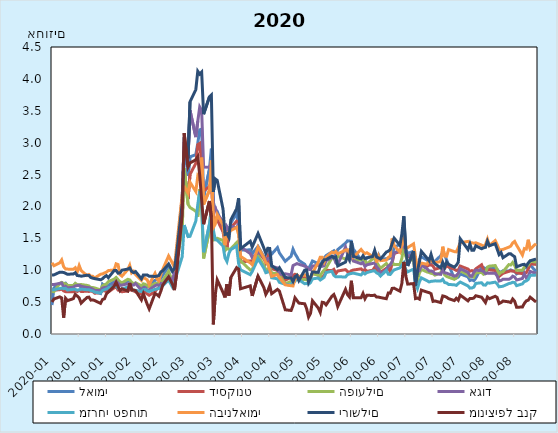
| Category | לאומי | דיסקונט | הפועלים | אגוד | מזרחי טפחות | הבינלאומי | ירושלים | מוניציפל בנק |
|---|---|---|---|---|---|---|---|---|
| 2020-01-01 02:00:00 | 0.454 | 0.688 | 0.67 | 0.778 | 0.696 | 1.116 | 0.926 | 0.502 |
| 2020-01-02 02:00:00 | 0.723 | 0.689 | 0.664 | 0.775 | 0.695 | 1.071 | 0.927 | 0.549 |
| 2020-01-05 02:00:00 | 0.786 | 0.694 | 0.792 | 0.794 | 0.712 | 1.116 | 0.969 | 0.582 |
| 2020-01-06 02:00:00 | 0.804 | 0.708 | 0.808 | 0.801 | 0.72 | 1.161 | 0.968 | 0.565 |
| 2020-01-07 02:00:00 | 0.787 | 0.676 | 0.791 | 0.736 | 0.711 | 1.055 | 0.965 | 0.256 |
| 2020-01-08 02:00:00 | 0.798 | 0.664 | 0.789 | 0.749 | 0.716 | 1.02 | 0.951 | 0.56 |
| 2020-01-09 02:00:00 | 0.761 | 0.664 | 0.76 | 0.724 | 0.69 | 1.017 | 0.936 | 0.523 |
| 2020-01-12 02:00:00 | 0.759 | 0.661 | 0.76 | 0.733 | 0.701 | 1.014 | 0.941 | 0.555 |
| 2020-01-13 02:00:00 | 0.786 | 0.683 | 0.794 | 0.754 | 0.699 | 1.039 | 0.96 | 0.623 |
| 2020-01-14 02:00:00 | 0.766 | 0.666 | 0.771 | 0.76 | 0.687 | 0.973 | 0.916 | 0.594 |
| 2020-01-15 02:00:00 | 0.759 | 0.686 | 0.773 | 0.766 | 0.693 | 1.073 | 0.914 | 0.564 |
| 2020-01-16 02:00:00 | 0.729 | 0.666 | 0.776 | 0.749 | 0.703 | 0.995 | 0.906 | 0.484 |
| 2020-01-19 02:00:00 | 0.705 | 0.671 | 0.762 | 0.729 | 0.694 | 0.916 | 0.921 | 0.573 |
| 2020-01-20 02:00:00 | 0.715 | 0.667 | 0.754 | 0.727 | 0.695 | 0.933 | 0.917 | 0.578 |
| 2020-01-21 02:00:00 | 0.72 | 0.674 | 0.728 | 0.718 | 0.682 | 0.904 | 0.886 | 0.531 |
| 2020-01-22 02:00:00 | 0.7 | 0.667 | 0.729 | 0.702 | 0.674 | 0.904 | 0.875 | 0.535 |
| 2020-01-23 02:00:00 | 0.663 | 0.639 | 0.722 | 0.683 | 0.656 | 0.879 | 0.868 | 0.524 |
| 2020-01-26 02:00:00 | 0.635 | 0.649 | 0.691 | 0.681 | 0.643 | 0.937 | 0.85 | 0.48 |
| 2020-01-27 02:00:00 | 0.782 | 0.683 | 0.756 | 0.72 | 0.682 | 0.942 | 0.867 | 0.541 |
| 2020-01-28 02:00:00 | 0.756 | 0.677 | 0.774 | 0.728 | 0.694 | 0.957 | 0.895 | 0.551 |
| 2020-01-29 02:00:00 | 0.751 | 0.666 | 0.784 | 0.73 | 0.707 | 0.97 | 0.916 | 0.627 |
| 2020-01-30 02:00:00 | 0.764 | 0.659 | 0.822 | 0.698 | 0.722 | 0.995 | 0.882 | 0.66 |
| 2020-02-02 02:00:00 | 0.821 | 0.723 | 0.86 | 0.782 | 0.749 | 1.005 | 0.996 | 0.75 |
| 2020-02-03 02:00:00 | 0.823 | 0.74 | 0.887 | 0.826 | 0.755 | 1.1 | 0.996 | 0.811 |
| 2020-02-04 02:00:00 | 0.808 | 0.689 | 0.851 | 0.798 | 0.716 | 1.088 | 0.953 | 0.742 |
| 2020-02-05 02:00:00 | 0.769 | 0.686 | 0.821 | 0.763 | 0.697 | 0.929 | 0.958 | 0.676 |
| 2020-02-06 02:00:00 | 0.772 | 0.663 | 0.802 | 0.767 | 0.705 | 0.907 | 1 | 0.709 |
| 2020-02-09 02:00:00 | 0.835 | 0.675 | 0.858 | 0.788 | 0.737 | 1.01 | 1.018 | 0.672 |
| 2020-02-10 02:00:00 | 0.832 | 0.698 | 0.849 | 0.789 | 0.735 | 1.078 | 1.035 | 0.798 |
| 2020-02-11 02:00:00 | 0.771 | 0.685 | 0.811 | 0.767 | 0.706 | 0.958 | 0.982 | 0.692 |
| 2020-02-12 02:00:00 | 0.78 | 0.675 | 0.788 | 0.767 | 0.685 | 0.984 | 0.962 | 0.69 |
| 2020-02-13 02:00:00 | 0.797 | 0.661 | 0.801 | 0.792 | 0.685 | 0.933 | 0.978 | 0.679 |
| 2020-02-16 02:00:00 | 0.725 | 0.625 | 0.756 | 0.686 | 0.665 | 0.841 | 0.866 | 0.535 |
| 2020-02-17 02:00:00 | 0.763 | 0.646 | 0.788 | 0.726 | 0.696 | 0.894 | 0.926 | 0.631 |
| 2020-02-18 02:00:00 | 0.741 | 0.652 | 0.779 | 0.726 | 0.7 | 0.869 | 0.924 | 0.549 |
| 2020-02-19 02:00:00 | 0.745 | 0.629 | 0.75 | 0.69 | 0.675 | 0.848 | 0.926 | 0.466 |
| 2020-02-20 02:00:00 | 0.779 | 0.607 | 0.74 | 0.694 | 0.667 | 0.774 | 0.906 | 0.394 |
| 2020-02-23 02:00:00 | 0.841 | 0.664 | 0.794 | 0.757 | 0.7 | 0.95 | 0.902 | 0.636 |
| 2020-02-24 02:00:00 | 0.851 | 0.706 | 0.79 | 0.771 | 0.707 | 0.864 | 0.907 | 0.618 |
| 2020-02-25 02:00:00 | 0.845 | 0.719 | 0.807 | 0.758 | 0.715 | 0.834 | 0.918 | 0.592 |
| 2020-02-26 02:00:00 | 0.871 | 0.741 | 0.813 | 0.792 | 0.736 | 0.936 | 0.973 | 0.672 |
| 2020-02-27 02:00:00 | 0.922 | 0.763 | 0.837 | 0.781 | 0.757 | 1.013 | 0.992 | 0.767 |
| 2020-03-01 02:00:00 | 1.062 | 0.87 | 0.983 | 0.895 | 0.846 | 1.224 | 1.098 | 0.896 |
| 2020-03-03 02:00:00 | 0.975 | 0.809 | 0.821 | 0.84 | 0.733 | 1.109 | 0.985 | 0.777 |
| 2020-03-04 02:00:00 | 1.003 | 0.834 | 0.874 | 0.975 | 0.776 | 1.041 | 1.024 | 0.688 |
| 2020-03-05 02:00:00 | 1.266 | 1.057 | 1.116 | 1.182 | 0.916 | 1.335 | 1.224 | 0.928 |
| 2020-03-08 02:00:00 | 2.106 | 1.816 | 1.621 | 2.161 | 1.213 | 2.184 | 2.049 | 1.867 |
| 2020-03-09 02:00:00 | 3.086 | 2.565 | 2.599 | 3.014 | 1.707 | 2.314 | 2.876 | 3.15 |
| 2020-03-11 02:00:00 | 2.483 | 2.116 | 2.034 | 2.767 | 1.527 | 2.209 | 2.752 | 2.619 |
| 2020-03-12 02:00:00 | 2.779 | 2.501 | 1.984 | 3.506 | 1.532 | 2.38 | 3.638 | 2.684 |
| 2020-03-15 02:00:00 | 2.813 | 2.676 | 1.925 | 3.088 | 1.771 | 2.234 | 3.833 | 2.73 |
| 2020-03-16 02:00:00 | 2.991 | 2.97 | 1.84 | 3.337 | 2.029 | 2.475 | 4.12 | 2.78 |
| 2020-03-17 02:00:00 | 3.201 | 2.989 | 2.27 | 3.559 | 2.242 | 2.424 | 4.074 | 2.492 |
| 2020-03-18 02:00:00 | 3.212 | 2.666 | 1.982 | 3.504 | 2.027 | 2.765 | 4.107 | 2.103 |
| 2020-03-19 02:00:00 | 2.149 | 2.245 | 1.183 | 2.619 | 1.282 | 2.031 | 3.447 | 1.721 |
| 2020-03-22 02:00:00 | 2.581 | 2.312 | 1.628 | 2.614 | 1.72 | 2.254 | 3.719 | 2.085 |
| 2020-03-23 02:00:00 | 2.905 | 2.41 | 2.053 | 2.687 | 1.972 | 2.721 | 3.749 | 1.831 |
| 2020-03-24 02:00:00 | 2.072 | 1.848 | 1.473 | 1.984 | 1.63 | 1.668 | 2.227 | 0.151 |
| 2020-03-25 02:00:00 | 1.951 | 1.809 | 1.479 | 1.986 | 1.479 | 1.721 | 2.432 | 0.612 |
| 2020-03-26 02:00:00 | 1.923 | 1.791 | 1.5 | 1.884 | 1.471 | 1.872 | 2.409 | 0.849 |
| 2020-03-29 03:00:00 | 1.683 | 1.601 | 1.467 | 1.763 | 1.381 | 1.712 | 1.957 | 0.651 |
| 2020-03-30 03:00:00 | 1.497 | 1.409 | 1.306 | 1.464 | 1.195 | 1.393 | 1.561 | 0.573 |
| 2020-03-31 03:00:00 | 1.463 | 1.336 | 1.342 | 1.684 | 1.137 | 1.573 | 1.573 | 0.782 |
| 2020-04-01 03:00:00 | 1.482 | 1.598 | 1.328 | 1.635 | 1.263 | 1.602 | 1.516 | 0.601 |
| 2020-04-02 03:00:00 | 1.738 | 1.663 | 1.335 | 1.693 | 1.323 | 1.623 | 1.789 | 0.886 |
| 2020-04-05 03:00:00 | 1.9 | 1.77 | 1.433 | 1.664 | 1.379 | 1.673 | 1.964 | 1.04 |
| 2020-04-06 03:00:00 | 1.653 | 1.755 | 1.194 | 1.723 | 1.107 | 1.556 | 2.129 | 1.017 |
| 2020-04-07 03:00:00 | 1.318 | 1.129 | 1.149 | 1.365 | 1.006 | 1.217 | 1.336 | 0.709 |
| 2020-04-12 03:00:00 | 1.319 | 1.147 | 1.003 | 1.262 | 0.93 | 1.115 | 1.454 | 0.755 |
| 2020-04-13 03:00:00 | 1.26 | 1.135 | 1.009 | 1.197 | 0.98 | 1.086 | 1.364 | 0.598 |
| 2020-04-16 03:00:00 | 1.373 | 1.293 | 1.227 | 1.281 | 1.18 | 1.362 | 1.575 | 0.907 |
| 2020-04-19 03:00:00 | 1.21 | 1.178 | 1.073 | 1.212 | 1.032 | 1.199 | 1.348 | 0.729 |
| 2020-04-20 03:00:00 | 1.114 | 1.123 | 1.013 | 1.141 | 0.961 | 1.119 | 1.265 | 0.621 |
| 2020-04-21 03:00:00 | 1.172 | 1.208 | 1.011 | 1.183 | 0.97 | 1.099 | 1.344 | 0.675 |
| 2020-04-22 03:00:00 | 1.299 | 1.103 | 1.055 | 1.191 | 1.023 | 1.004 | 1.342 | 0.756 |
| 2020-04-23 03:00:00 | 1.252 | 1.025 | 0.952 | 1.062 | 0.882 | 0.904 | 1.072 | 0.632 |
| 2020-04-26 03:00:00 | 1.355 | 0.995 | 0.949 | 1.036 | 0.865 | 0.932 | 1.008 | 0.7 |
| 2020-04-27 03:00:00 | 1.271 | 0.945 | 0.915 | 0.934 | 0.81 | 0.881 | 1.039 | 0.672 |
| 2020-04-30 03:00:00 | 1.14 | 0.843 | 0.787 | 0.944 | 0.78 | 0.771 | 0.886 | 0.38 |
| 2020-05-03 03:00:00 | 1.22 | 0.888 | 0.825 | 0.927 | 0.769 | 0.757 | 0.878 | 0.369 |
| 2020-05-04 03:00:00 | 1.33 | 0.919 | 0.85 | 1.073 | 0.821 | 0.754 | 0.824 | 0.446 |
| 2020-05-05 03:00:00 | 1.259 | 0.937 | 0.859 | 1.087 | 0.825 | 0.856 | 0.899 | 0.568 |
| 2020-05-06 03:00:00 | 1.21 | 0.928 | 0.912 | 1.104 | 0.873 | 0.885 | 0.919 | 0.527 |
| 2020-05-07 03:00:00 | 1.154 | 0.902 | 0.839 | 1.094 | 0.851 | 0.894 | 0.837 | 0.484 |
| 2020-05-10 03:00:00 | 1.094 | 0.883 | 0.857 | 1.065 | 0.788 | 0.928 | 1.001 | 0.474 |
| 2020-05-11 03:00:00 | 1.035 | 0.864 | 0.847 | 1.05 | 0.793 | 0.911 | 1.003 | 0.396 |
| 2020-05-12 03:00:00 | 1.025 | 0.839 | 0.851 | 1.017 | 0.78 | 0.873 | 0.814 | 0.265 |
| 2020-05-13 03:00:00 | 1.08 | 0.864 | 0.896 | 1.008 | 0.805 | 0.891 | 0.886 | 0.324 |
| 2020-05-14 03:00:00 | 1.145 | 0.958 | 0.944 | 1.064 | 0.864 | 0.954 | 0.973 | 0.521 |
| 2020-05-17 03:00:00 | 1.103 | 0.921 | 0.924 | 1.081 | 0.878 | 1.128 | 0.967 | 0.406 |
| 2020-05-18 03:00:00 | 1.063 | 0.889 | 0.908 | 1.065 | 0.846 | 1.204 | 1.065 | 0.339 |
| 2020-05-19 03:00:00 | 1.141 | 0.893 | 0.966 | 1.061 | 0.867 | 1.203 | 1.116 | 0.497 |
| 2020-05-20 03:00:00 | 1.19 | 0.912 | 1.003 | 1.07 | 0.889 | 1.128 | 1.164 | 0.491 |
| 2020-05-21 03:00:00 | 1.23 | 0.999 | 1.035 | 1.149 | 0.964 | 1.203 | 1.165 | 0.457 |
| 2020-05-24 03:00:00 | 1.285 | 0.995 | 1.192 | 1.199 | 0.984 | 1.284 | 1.221 | 0.593 |
| 2020-05-25 03:00:00 | 1.304 | 1.014 | 1.187 | 1.216 | 0.92 | 1.27 | 1.195 | 0.619 |
| 2020-05-26 03:00:00 | 1.244 | 0.946 | 1.143 | 1.116 | 0.896 | 1.294 | 1.207 | 0.545 |
| 2020-05-27 03:00:00 | 1.324 | 0.988 | 1.22 | 1.091 | 0.898 | 1.255 | 1.067 | 0.43 |
| 2020-05-31 03:00:00 | 1.425 | 1.009 | 1.176 | 1.362 | 0.894 | 1.317 | 1.127 | 0.7 |
| 2020-06-01 03:00:00 | 1.46 | 0.98 | 1.181 | 1.258 | 0.931 | 1.321 | 1.227 | 0.618 |
| 2020-06-02 03:00:00 | 1.457 | 0.961 | 1.178 | 1.165 | 0.942 | 1.22 | 1.167 | 0.581 |
| 2020-06-03 03:00:00 | 1.455 | 0.992 | 1.201 | 1.234 | 0.949 | 1.291 | 1.455 | 0.835 |
| 2020-06-04 03:00:00 | 1.333 | 1.003 | 1.148 | 1.145 | 0.955 | 1.203 | 1.215 | 0.567 |
| 2020-06-08 03:00:00 | 1.159 | 1.022 | 1.162 | 1.101 | 0.926 | 1.326 | 1.179 | 0.568 |
| 2020-06-09 03:00:00 | 1.152 | 0.99 | 1.188 | 1.116 | 0.961 | 1.287 | 1.227 | 0.636 |
| 2020-06-10 03:00:00 | 1.148 | 1.012 | 1.154 | 1.058 | 0.941 | 1.261 | 1.182 | 0.553 |
| 2020-06-11 03:00:00 | 1.197 | 0.984 | 1.097 | 1.085 | 0.963 | 1.275 | 1.192 | 0.609 |
| 2020-06-14 03:00:00 | 1.224 | 1 | 1.179 | 1.107 | 0.988 | 1.214 | 1.216 | 0.603 |
| 2020-06-15 03:00:00 | 1.245 | 1.045 | 1.18 | 1.113 | 0.991 | 1.283 | 1.312 | 0.61 |
| 2020-06-16 03:00:00 | 1.174 | 1.013 | 1.122 | 1.053 | 0.958 | 1.122 | 1.207 | 0.579 |
| 2020-06-17 03:00:00 | 1.24 | 0.985 | 1.077 | 1.019 | 0.944 | 1.224 | 1.192 | 0.578 |
| 2020-06-18 03:00:00 | 1.17 | 0.966 | 1.03 | 0.946 | 0.909 | 1.15 | 1.176 | 0.572 |
| 2020-06-21 03:00:00 | 1.182 | 1.029 | 1.106 | 1.006 | 0.996 | 1.159 | 1.285 | 0.553 |
| 2020-06-22 03:00:00 | 1.18 | 1.041 | 1.059 | 1.066 | 0.937 | 1.2 | 1.299 | 0.643 |
| 2020-06-23 03:00:00 | 1.191 | 0.977 | 1.092 | 1.081 | 0.933 | 1.221 | 1.324 | 0.64 |
| 2020-06-24 03:00:00 | 1.236 | 1.116 | 1.125 | 1.141 | 0.973 | 1.498 | 1.418 | 0.715 |
| 2020-06-25 03:00:00 | 1.357 | 1.264 | 1.088 | 1.27 | 1.004 | 1.382 | 1.503 | 0.719 |
| 2020-06-28 03:00:00 | 1.406 | 1.291 | 1.09 | 1.315 | 1.037 | 1.285 | 1.39 | 0.672 |
| 2020-06-29 03:00:00 | 1.487 | 1.295 | 1.189 | 1.38 | 1.081 | 1.403 | 1.571 | 0.795 |
| 2020-06-30 03:00:00 | 1.582 | 1.354 | 1.379 | 1.411 | 1.118 | 1.545 | 1.847 | 1.13 |
| 2020-07-01 03:00:00 | 1.326 | 1.266 | 1.221 | 1.28 | 1.007 | 1.334 | 1.335 | 0.908 |
| 2020-07-02 03:00:00 | 1.265 | 1.209 | 1.134 | 1.22 | 0.974 | 1.354 | 1.067 | 0.782 |
| 2020-07-05 03:00:00 | 1.296 | 1.239 | 1.178 | 1.257 | 1.019 | 1.413 | 1.298 | 0.791 |
| 2020-07-06 03:00:00 | 0.967 | 0.998 | 0.875 | 1.004 | 0.798 | 1.207 | 0.759 | 0.555 |
| 2020-07-07 03:00:00 | 0.959 | 0.91 | 0.842 | 0.976 | 0.714 | 1.014 | 0.992 | 0.564 |
| 2020-07-08 03:00:00 | 1.172 | 0.991 | 0.955 | 0.995 | 0.816 | 1.072 | 1.131 | 0.547 |
| 2020-07-09 03:00:00 | 1.21 | 1.096 | 1.013 | 1.077 | 0.881 | 1.112 | 1.296 | 0.688 |
| 2020-07-12 03:00:00 | 1.159 | 1.062 | 0.972 | 1.022 | 0.835 | 1.094 | 1.188 | 0.656 |
| 2020-07-13 03:00:00 | 1.124 | 1.081 | 0.964 | 0.988 | 0.816 | 1.158 | 1.15 | 0.648 |
| 2020-07-14 03:00:00 | 1.103 | 1.085 | 0.951 | 0.989 | 0.825 | 1.143 | 1.249 | 0.632 |
| 2020-07-15 03:00:00 | 1.13 | 1.066 | 0.946 | 0.979 | 0.828 | 1.132 | 1.144 | 0.511 |
| 2020-07-16 03:00:00 | 1.139 | 1.015 | 0.923 | 0.946 | 0.833 | 1.121 | 1.1 | 0.518 |
| 2020-07-19 03:00:00 | 1.229 | 1.043 | 0.961 | 0.935 | 0.832 | 1.134 | 1.036 | 0.493 |
| 2020-07-20 03:00:00 | 1.286 | 1.062 | 1.03 | 1.004 | 0.857 | 1.369 | 1.123 | 0.597 |
| 2020-07-21 03:00:00 | 1.24 | 1.028 | 0.927 | 0.958 | 0.807 | 1.222 | 1.044 | 0.589 |
| 2020-07-22 03:00:00 | 1.161 | 1.071 | 0.903 | 0.954 | 0.8 | 1.219 | 1.129 | 0.577 |
| 2020-07-23 03:00:00 | 1.086 | 1.052 | 0.89 | 0.942 | 0.777 | 1.324 | 1.092 | 0.554 |
| 2020-07-26 03:00:00 | 0.872 | 1.014 | 0.857 | 0.91 | 0.771 | 1.291 | 1.048 | 0.524 |
| 2020-07-27 03:00:00 | 0.878 | 0.997 | 0.878 | 0.913 | 0.763 | 1.288 | 1.079 | 0.56 |
| 2020-07-28 03:00:00 | 0.893 | 1.003 | 0.946 | 0.951 | 0.791 | 1.353 | 1.124 | 0.529 |
| 2020-07-29 03:00:00 | 0.941 | 1.066 | 0.991 | 1.025 | 0.814 | 1.43 | 1.493 | 0.61 |
| 2020-08-02 03:00:00 | 0.897 | 1.019 | 0.929 | 0.966 | 0.754 | 1.452 | 1.325 | 0.52 |
| 2020-08-03 03:00:00 | 0.838 | 0.984 | 0.896 | 0.911 | 0.719 | 1.432 | 1.413 | 0.557 |
| 2020-08-04 03:00:00 | 0.85 | 0.995 | 0.904 | 0.906 | 0.722 | 1.431 | 1.312 | 0.555 |
| 2020-08-05 03:00:00 | 0.834 | 0.983 | 0.892 | 0.965 | 0.735 | 1.423 | 1.314 | 0.564 |
| 2020-08-06 03:00:00 | 0.875 | 1.021 | 0.957 | 1.001 | 0.793 | 1.431 | 1.384 | 0.6 |
| 2020-08-09 03:00:00 | 1.048 | 1.086 | 0.968 | 0.993 | 0.804 | 1.394 | 1.337 | 0.577 |
| 2020-08-10 03:00:00 | 1.041 | 1.009 | 0.935 | 0.982 | 0.768 | 1.376 | 1.351 | 0.536 |
| 2020-08-11 03:00:00 | 1.026 | 0.966 | 0.95 | 0.945 | 0.766 | 1.402 | 1.358 | 0.494 |
| 2020-08-12 03:00:00 | 1.014 | 1.003 | 1.05 | 0.955 | 0.802 | 1.488 | 1.456 | 0.581 |
| 2020-08-13 03:00:00 | 1.027 | 1.007 | 1.064 | 0.951 | 0.797 | 1.387 | 1.384 | 0.554 |
| 2020-08-16 03:00:00 | 1.029 | 0.995 | 1.073 | 0.952 | 0.813 | 1.464 | 1.415 | 0.592 |
| 2020-08-17 03:00:00 | 1.013 | 0.961 | 1.014 | 0.91 | 0.785 | 1.402 | 1.333 | 0.573 |
| 2020-08-18 03:00:00 | 0.977 | 0.903 | 0.937 | 0.83 | 0.739 | 1.326 | 1.246 | 0.477 |
| 2020-08-19 03:00:00 | 0.97 | 0.928 | 0.969 | 0.839 | 0.744 | 1.32 | 1.278 | 0.492 |
| 2020-08-20 03:00:00 | 0.991 | 0.952 | 0.976 | 0.859 | 0.749 | 1.326 | 1.196 | 0.517 |
| 2020-08-23 03:00:00 | 0.988 | 0.982 | 1.088 | 0.858 | 0.79 | 1.362 | 1.258 | 0.504 |
| 2020-08-24 03:00:00 | 1.005 | 0.99 | 1.082 | 0.874 | 0.798 | 1.378 | 1.257 | 0.494 |
| 2020-08-25 03:00:00 | 0.991 | 0.986 | 1.121 | 0.907 | 0.811 | 1.428 | 1.231 | 0.549 |
| 2020-08-26 03:00:00 | 0.984 | 0.984 | 1.074 | 0.894 | 0.807 | 1.452 | 1.211 | 0.515 |
| 2020-08-27 03:00:00 | 0.942 | 0.958 | 0.998 | 0.847 | 0.758 | 1.393 | 1.053 | 0.419 |
| 2020-08-30 03:00:00 | 0.984 | 0.947 | 0.999 | 0.87 | 0.786 | 1.238 | 1.088 | 0.423 |
| 2020-08-31 03:00:00 | 1.037 | 0.962 | 1.048 | 0.945 | 0.823 | 1.34 | 1.093 | 0.48 |
| 2020-09-01 03:00:00 | 1.038 | 0.962 | 1.069 | 0.88 | 0.832 | 1.332 | 1.067 | 0.52 |
| 2020-09-02 03:00:00 | 1.048 | 1.019 | 1.083 | 0.909 | 0.855 | 1.478 | 1.114 | 0.53 |
| 2020-09-03 03:00:00 | 1.081 | 1.1 | 1.144 | 0.981 | 0.918 | 1.331 | 1.148 | 0.577 |
| 2020-09-06 03:00:00 | 0.98 | 1.091 | 1.126 | 0.95 | 0.924 | 1.416 | 1.175 | 0.502 |